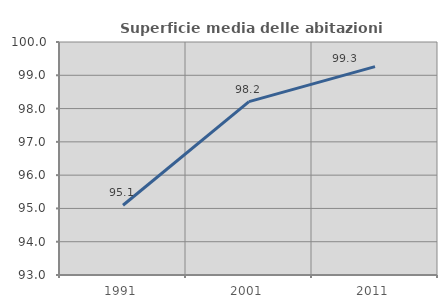
| Category | Superficie media delle abitazioni occupate |
|---|---|
| 1991.0 | 95.095 |
| 2001.0 | 98.208 |
| 2011.0 | 99.259 |